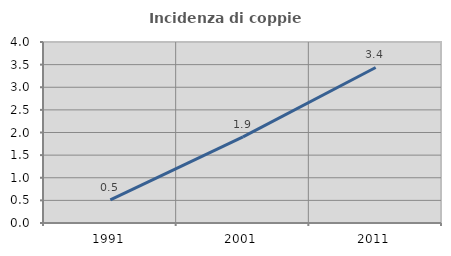
| Category | Incidenza di coppie miste |
|---|---|
| 1991.0 | 0.512 |
| 2001.0 | 1.904 |
| 2011.0 | 3.437 |